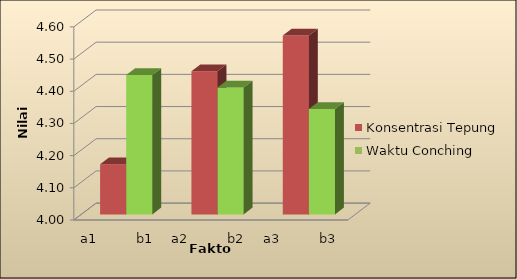
| Category | Konsentrasi Tepung | Waktu Conching |
|---|---|---|
| a1          b1 | 4.156 | 4.433 |
| a2          b2 | 4.444 | 4.394 |
| a3          b3 | 4.556 | 4.328 |